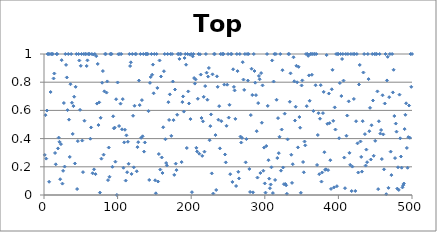
| Category | Top Slice |
|---|---|
| 0 | 0.284 |
| 1 | 0.566 |
| 2 | 0.258 |
| 3 | 0.599 |
| 4 | 1 |
| 5 | 1 |
| 6 | 0.094 |
| 7 | 1 |
| 8 | 0.73 |
| 9 | 1 |
| 10 | 1 |
| 11 | 1 |
| 12 | 0.826 |
| 13 | 0.862 |
| 14 | 0.298 |
| 15 | 0.218 |
| 16 | 1 |
| 17 | 1 |
| 18 | 0.33 |
| 19 | 0.407 |
| 20 | 0.377 |
| 21 | 0.112 |
| 22 | 0.361 |
| 23 | 0.956 |
| 24 | 0.081 |
| 25 | 0.171 |
| 26 | 0.652 |
| 27 | 0.202 |
| 28 | 1 |
| 29 | 0.923 |
| 30 | 0.834 |
| 31 | 0.602 |
| 32 | 1 |
| 33 | 0.534 |
| 34 | 0.27 |
| 35 | 0.786 |
| 36 | 1 |
| 37 | 0.654 |
| 38 | 0.433 |
| 39 | 0.63 |
| 40 | 0.697 |
| 41 | 0.224 |
| 42 | 0.767 |
| 43 | 1 |
| 44 | 0.042 |
| 45 | 0.382 |
| 46 | 1 |
| 47 | 0.954 |
| 48 | 0.604 |
| 49 | 0.916 |
| 50 | 1 |
| 51 | 0.386 |
| 52 | 0.162 |
| 53 | 1 |
| 54 | 0.527 |
| 55 | 1 |
| 56 | 1 |
| 57 | 0.915 |
| 58 | 0.955 |
| 59 | 1 |
| 60 | 1 |
| 61 | 1 |
| 62 | 0.399 |
| 63 | 0.479 |
| 64 | 1 |
| 65 | 0.154 |
| 66 | 0.997 |
| 67 | 0.182 |
| 68 | 1 |
| 69 | 0.148 |
| 70 | 0.985 |
| 71 | 0.648 |
| 72 | 0.929 |
| 73 | 0.496 |
| 74 | 0.657 |
| 75 | 0.017 |
| 76 | 0.547 |
| 77 | 0.258 |
| 78 | 0.796 |
| 79 | 0.879 |
| 80 | 0.286 |
| 81 | 0.735 |
| 82 | 1 |
| 83 | 1 |
| 84 | 0.726 |
| 85 | 0.805 |
| 86 | 0.105 |
| 87 | 0.337 |
| 88 | 0.129 |
| 89 | 1 |
| 90 | 1 |
| 91 | 1 |
| 92 | 0.2 |
| 93 | 0.558 |
| 94 | 0.473 |
| 95 | 0.478 |
| 96 | 0.236 |
| 97 | 0.679 |
| 98 | 0 |
| 99 | 0.798 |
| 100 | 0.999 |
| 101 | 0.489 |
| 102 | 1 |
| 103 | 0.648 |
| 104 | 1 |
| 105 | 0.466 |
| 106 | 0.68 |
| 107 | 0.193 |
| 108 | 0.373 |
| 109 | 0.463 |
| 110 | 0.102 |
| 111 | 0.423 |
| 112 | 0.162 |
| 113 | 0.378 |
| 114 | 0.221 |
| 115 | 1 |
| 116 | 0.915 |
| 117 | 0.941 |
| 118 | 0.15 |
| 119 | 1 |
| 120 | 0.562 |
| 121 | 0.196 |
| 122 | 0.633 |
| 123 | 1 |
| 124 | 1 |
| 125 | 0.168 |
| 126 | 0.34 |
| 127 | 0.375 |
| 128 | 0.812 |
| 129 | 0.638 |
| 130 | 1 |
| 131 | 0.405 |
| 132 | 0.673 |
| 133 | 0.416 |
| 134 | 1 |
| 135 | 0.308 |
| 136 | 0.373 |
| 137 | 1 |
| 138 | 1 |
| 139 | 1 |
| 140 | 1 |
| 141 | 0.595 |
| 142 | 0.106 |
| 143 | 0.795 |
| 144 | 0.837 |
| 145 | 1 |
| 146 | 0.853 |
| 147 | 0.925 |
| 148 | 0.721 |
| 149 | 1 |
| 150 | 0.104 |
| 151 | 0.012 |
| 152 | 1 |
| 153 | 0.759 |
| 154 | 0.096 |
| 155 | 0.29 |
| 156 | 0.954 |
| 157 | 0.18 |
| 158 | 0.841 |
| 159 | 0.266 |
| 160 | 0.156 |
| 161 | 0.48 |
| 162 | 0.878 |
| 163 | 1 |
| 164 | 0.396 |
| 165 | 0.227 |
| 166 | 0.209 |
| 167 | 1 |
| 168 | 0.658 |
| 169 | 0.533 |
| 170 | 0.714 |
| 171 | 1 |
| 172 | 0.419 |
| 173 | 1 |
| 174 | 0.805 |
| 175 | 0.531 |
| 176 | 0.143 |
| 177 | 0.748 |
| 178 | 0.222 |
| 179 | 0.176 |
| 180 | 0.569 |
| 181 | 1 |
| 182 | 1 |
| 183 | 0.965 |
| 184 | 1 |
| 185 | 1 |
| 186 | 0.233 |
| 187 | 0.659 |
| 188 | 0.699 |
| 189 | 0.592 |
| 190 | 0.972 |
| 191 | 1 |
| 192 | 0.924 |
| 193 | 0.333 |
| 194 | 1 |
| 195 | 0.735 |
| 196 | 0.649 |
| 197 | 0.996 |
| 198 | 0.538 |
| 199 | 1 |
| 200 | 0.02 |
| 201 | 0.983 |
| 202 | 1 |
| 203 | 0.829 |
| 204 | 0.79 |
| 205 | 0.82 |
| 206 | 0.334 |
| 207 | 0.309 |
| 208 | 0.682 |
| 209 | 1 |
| 210 | 0.293 |
| 211 | 0.998 |
| 212 | 0.854 |
| 213 | 0.546 |
| 214 | 0.277 |
| 215 | 0.523 |
| 216 | 0.696 |
| 217 | 0.307 |
| 218 | 0.773 |
| 219 | 1 |
| 220 | 0.868 |
| 221 | 0.676 |
| 222 | 0.84 |
| 223 | 0.901 |
| 224 | 0.388 |
| 225 | 0.488 |
| 226 | 0.572 |
| 227 | 0.153 |
| 228 | 0.856 |
| 229 | 0.01 |
| 230 | 1 |
| 231 | 1 |
| 232 | 0.425 |
| 233 | 0.036 |
| 234 | 0.842 |
| 235 | 0.767 |
| 236 | 0.534 |
| 237 | 0.63 |
| 238 | 0.331 |
| 239 | 1 |
| 240 | 0.524 |
| 241 | 1 |
| 242 | 1 |
| 243 | 1 |
| 244 | 0.783 |
| 245 | 0.287 |
| 246 | 0.231 |
| 247 | 0.491 |
| 248 | 0.782 |
| 249 | 1 |
| 250 | 0.549 |
| 251 | 0.64 |
| 252 | 0.148 |
| 253 | 1 |
| 254 | 1 |
| 255 | 0.093 |
| 256 | 0.891 |
| 257 | 0.767 |
| 258 | 0.742 |
| 259 | 0.54 |
| 260 | 0.064 |
| 261 | 1 |
| 262 | 0.879 |
| 263 | 0.164 |
| 264 | 0.118 |
| 265 | 1 |
| 266 | 0.414 |
| 267 | 0.372 |
| 268 | 0.405 |
| 269 | 0.942 |
| 270 | 0.819 |
| 271 | 0.745 |
| 272 | 1 |
| 273 | 0.232 |
| 274 | 0.397 |
| 275 | 1 |
| 276 | 0.812 |
| 277 | 1 |
| 278 | 0.185 |
| 279 | 0.022 |
| 280 | 0.567 |
| 281 | 0.895 |
| 282 | 0.709 |
| 283 | 0.019 |
| 284 | 1 |
| 285 | 0.879 |
| 286 | 0.796 |
| 287 | 0.708 |
| 288 | 0.453 |
| 289 | 0.124 |
| 290 | 0.652 |
| 291 | 0.845 |
| 292 | 0.821 |
| 293 | 0.156 |
| 294 | 0.864 |
| 295 | 0.513 |
| 296 | 0.777 |
| 297 | 0.172 |
| 298 | 0.336 |
| 299 | 0.082 |
| 300 | 0.017 |
| 301 | 0.348 |
| 302 | 1 |
| 303 | 0.632 |
| 304 | 0.247 |
| 305 | 0.116 |
| 306 | 0.048 |
| 307 | 0.075 |
| 308 | 0.197 |
| 309 | 0.954 |
| 310 | 0.014 |
| 311 | 0.805 |
| 312 | 1 |
| 313 | 0.107 |
| 314 | 1 |
| 315 | 0.675 |
| 316 | 0.262 |
| 317 | 0.545 |
| 318 | 0.297 |
| 319 | 0.413 |
| 320 | 1 |
| 321 | 0.173 |
| 322 | 0.464 |
| 323 | 0.885 |
| 324 | 0.195 |
| 325 | 0.077 |
| 326 | 0.577 |
| 327 | 0.078 |
| 328 | 0.069 |
| 329 | 0.009 |
| 330 | 0.395 |
| 331 | 1 |
| 332 | 1 |
| 333 | 0.661 |
| 334 | 0.863 |
| 335 | 0.285 |
| 336 | 0.086 |
| 337 | 0.218 |
| 338 | 0.977 |
| 339 | 0.807 |
| 340 | 0.528 |
| 341 | 0.626 |
| 342 | 0.916 |
| 343 | 0.799 |
| 344 | 0.338 |
| 345 | 0.909 |
| 346 | 0.553 |
| 347 | 0.477 |
| 348 | 0.015 |
| 349 | 0.777 |
| 350 | 0.813 |
| 351 | 0.234 |
| 352 | 0.161 |
| 353 | 0.379 |
| 354 | 0.352 |
| 355 | 1 |
| 356 | 0.63 |
| 357 | 1 |
| 358 | 0.987 |
| 359 | 0.848 |
| 360 | 0.668 |
| 361 | 1 |
| 362 | 1 |
| 363 | 0.853 |
| 364 | 1 |
| 365 | 0.596 |
| 366 | 1 |
| 367 | 1 |
| 368 | 0.778 |
| 369 | 1 |
| 370 | 0.213 |
| 371 | 0.425 |
| 372 | 0.58 |
| 373 | 0.148 |
| 374 | 0.541 |
| 375 | 0.779 |
| 376 | 0.095 |
| 377 | 0.16 |
| 378 | 0.581 |
| 379 | 0.731 |
| 380 | 0.304 |
| 381 | 0.179 |
| 382 | 0.182 |
| 383 | 0.992 |
| 384 | 0.505 |
| 385 | 0.176 |
| 386 | 0.72 |
| 387 | 0.51 |
| 388 | 0.247 |
| 389 | 0.043 |
| 390 | 0.75 |
| 391 | 0.888 |
| 392 | 0.526 |
| 393 | 0.054 |
| 394 | 0.621 |
| 395 | 0.464 |
| 396 | 1 |
| 397 | 0.063 |
| 398 | 1 |
| 399 | 1 |
| 400 | 0.403 |
| 401 | 0.794 |
| 402 | 1 |
| 403 | 0.702 |
| 404 | 0.965 |
| 405 | 1 |
| 406 | 0.811 |
| 407 | 0.265 |
| 408 | 0.048 |
| 409 | 1 |
| 410 | 0.42 |
| 411 | 0.564 |
| 412 | 1 |
| 413 | 0.664 |
| 414 | 0.299 |
| 415 | 0.214 |
| 416 | 1 |
| 417 | 0.028 |
| 418 | 0.202 |
| 419 | 1 |
| 420 | 0.681 |
| 421 | 1 |
| 422 | 0.029 |
| 423 | 0.523 |
| 424 | 1 |
| 425 | 0.367 |
| 426 | 0.159 |
| 427 | 0.784 |
| 428 | 0.922 |
| 429 | 0.38 |
| 430 | 0.27 |
| 431 | 0.166 |
| 432 | 0.524 |
| 433 | 0.869 |
| 434 | 1 |
| 435 | 0.432 |
| 436 | 0.209 |
| 437 | 0.322 |
| 438 | 0.233 |
| 439 | 1 |
| 440 | 0.822 |
| 441 | 0.452 |
| 442 | 0.618 |
| 443 | 0.252 |
| 444 | 0.495 |
| 445 | 1 |
| 446 | 0.67 |
| 447 | 0.278 |
| 448 | 1 |
| 449 | 0.384 |
| 450 | 1 |
| 451 | 1 |
| 452 | 0.735 |
| 453 | 0.042 |
| 454 | 0.523 |
| 455 | 1 |
| 456 | 0.436 |
| 457 | 0.461 |
| 458 | 0.255 |
| 459 | 0.707 |
| 460 | 0.43 |
| 461 | 0.182 |
| 462 | 0.649 |
| 463 | 1 |
| 464 | 0.006 |
| 465 | 0.812 |
| 466 | 0.98 |
| 467 | 0.051 |
| 468 | 0.694 |
| 469 | 1 |
| 470 | 0.308 |
| 471 | 0.141 |
| 472 | 1 |
| 473 | 0.728 |
| 474 | 0.888 |
| 475 | 0.56 |
| 476 | 0.262 |
| 477 | 0.507 |
| 478 | 0.449 |
| 479 | 0.045 |
| 480 | 0.197 |
| 481 | 0.036 |
| 482 | 0.712 |
| 483 | 0.402 |
| 484 | 0.273 |
| 485 | 0.194 |
| 486 | 0.054 |
| 487 | 0.069 |
| 488 | 0.081 |
| 489 | 0.467 |
| 490 | 0.569 |
| 491 | 0.65 |
| 492 | 0.334 |
| 493 | 0.193 |
| 494 | 0.41 |
| 495 | 0.635 |
| 496 | 0.406 |
| 497 | 1 |
| 498 | 0.767 |
| 499 | 1 |